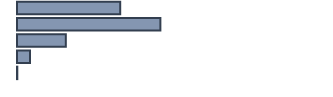
| Category | Series 0 |
|---|---|
| 0 | 33.4 |
| 1 | 46.4 |
| 2 | 15.8 |
| 3 | 4.2 |
| 4 | 0.1 |